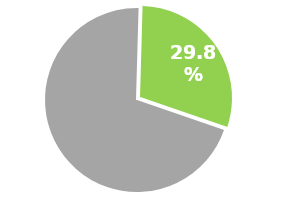
| Category | Series 0 |
|---|---|
| 0 | 0.702 |
| 1 | 0.298 |